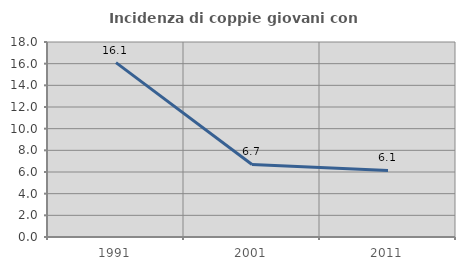
| Category | Incidenza di coppie giovani con figli |
|---|---|
| 1991.0 | 16.092 |
| 2001.0 | 6.694 |
| 2011.0 | 6.14 |